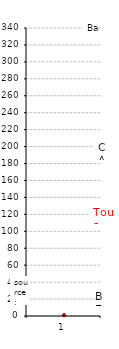
| Category | CAP | BEP | Bac Pro | Tout Pro |
|---|---|---|---|---|
| 0 | 1 | 1 | 1 | 1 |